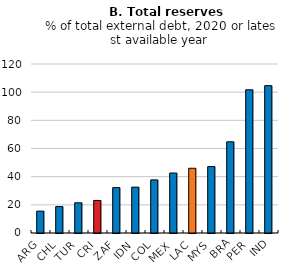
| Category | Series 0 |
|---|---|
| ARG | 15.528 |
| CHL | 18.758 |
| TUR | 21.453 |
| CRI | 23.113 |
| ZAF | 32.213 |
| IDN | 32.552 |
| COL | 37.7 |
| MEX | 42.581 |
| LAC | 45.972 |
| MYS | 47.155 |
| BRA | 64.747 |
| PER | 101.672 |
| IND | 104.617 |